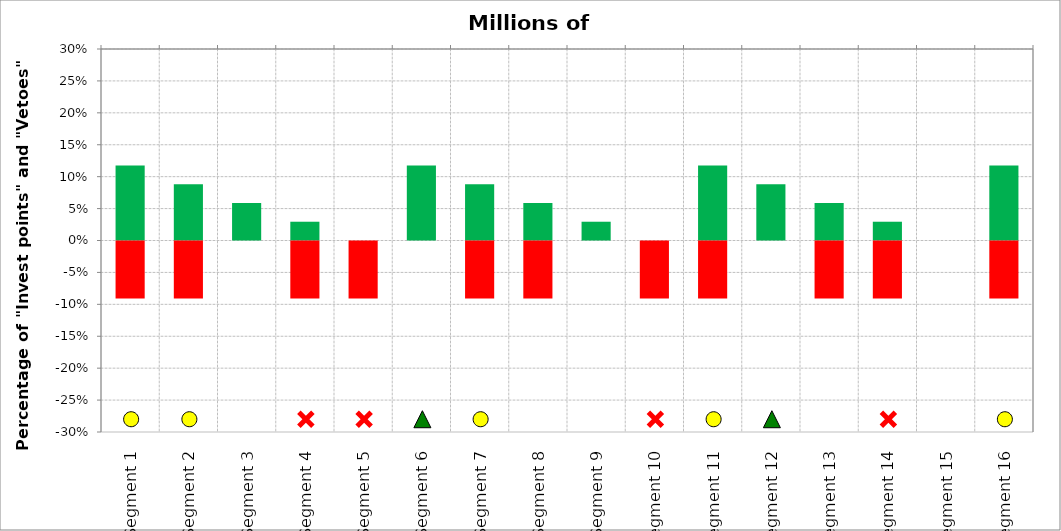
| Category | Invest | Veto |
|---|---|---|
| Segment 1 | 0.118 | -0.091 |
| Segment 2 | 0.088 | -0.091 |
| Segment 3 | 0.059 | 0 |
| Segment 4 | 0.029 | -0.091 |
| Segment 5 | 0 | -0.091 |
| Segment 6 | 0.118 | 0 |
| Segment 7 | 0.088 | -0.091 |
| Segment 8 | 0.059 | -0.091 |
| Segment 9 | 0.029 | 0 |
| Segment 10 | 0 | -0.091 |
| Segment 11 | 0.118 | -0.091 |
| Segment 12 | 0.088 | 0 |
| Segment 13 | 0.059 | -0.091 |
| Segment 14 | 0.029 | -0.091 |
| Segment 15 | 0 | 0 |
| Segment 16 | 0.118 | -0.091 |